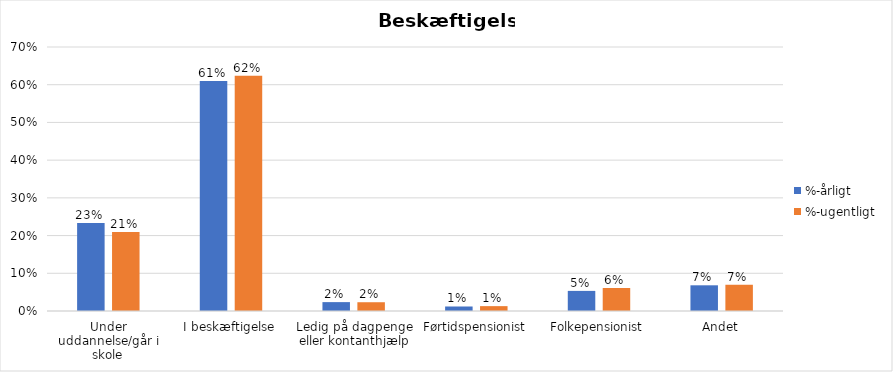
| Category | %-årligt | %-ugentligt |
|---|---|---|
| Under uddannelse/går i skole | 0.233 | 0.209 |
| I beskæftigelse | 0.61 | 0.624 |
| Ledig på dagpenge eller kontanthjælp | 0.024 | 0.023 |
| Førtidspensionist | 0.012 | 0.013 |
| Folkepensionist | 0.053 | 0.061 |
| Andet | 0.068 | 0.07 |